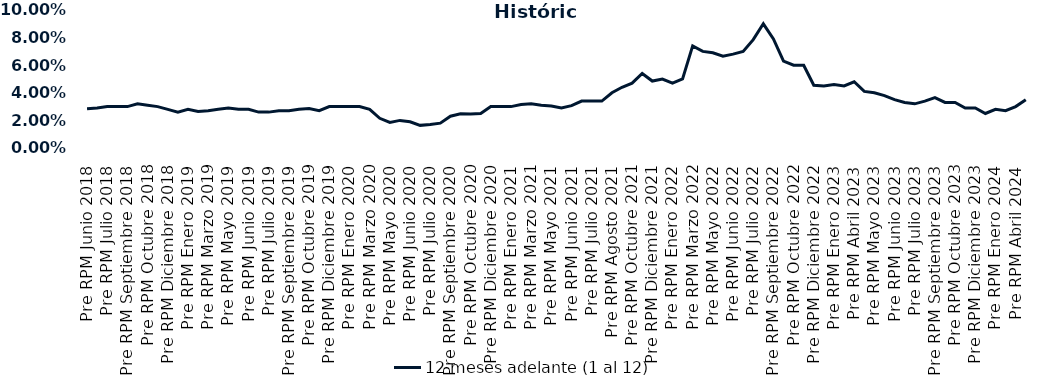
| Category | 12 meses adelante (1 al 12)  |
|---|---|
| Pre RPM Junio 2018 | 0.028 |
| Post RPM Junio 2018 | 0.029 |
| Pre RPM Julio 2018 | 0.03 |
| Post RPM Julio 2018 | 0.03 |
| Pre RPM Septiembre 2018 | 0.03 |
| Post RPM Septiembre 2018 | 0.032 |
| Pre RPM Octubre 2018 | 0.031 |
| Post RPM Octubre 2018 | 0.03 |
| Pre RPM Diciembre 2018 | 0.028 |
| Post RPM Diciembre 2018 | 0.026 |
| Pre RPM Enero 2019 | 0.028 |
| Post RPM Enero 2019 | 0.026 |
| Pre RPM Marzo 2019 | 0.027 |
| Post RPM Marzo 2019 | 0.028 |
| Pre RPM Mayo 2019 | 0.029 |
| Post RPM Mayo 2019 | 0.028 |
| Pre RPM Junio 2019 | 0.028 |
| Post RPM Junio 2019 | 0.026 |
| Pre RPM Julio 2019 | 0.026 |
| Post RPM Julio 2019 | 0.027 |
| Pre RPM Septiembre 2019 | 0.027 |
| Post RPM Septiembre 2019 | 0.028 |
| Pre RPM Octubre 2019 | 0.029 |
| Post RPM Octubre 2019 | 0.027 |
| Pre RPM Diciembre 2019 | 0.03 |
| Post RPM Diciembre 2019 | 0.03 |
| Pre RPM Enero 2020 | 0.03 |
| Post RPM Enero 2020 | 0.03 |
| Pre RPM Marzo 2020 | 0.028 |
| Post RPM Marzo 2020 | 0.022 |
| Pre RPM Mayo 2020 | 0.018 |
| Post RPM Mayo 2020 | 0.02 |
| Pre RPM Junio 2020 | 0.019 |
| Post RPM Junio 2020 | 0.016 |
| Pre RPM Julio 2020 | 0.017 |
| Post RPM Julio 2020 | 0.018 |
| Pre RPM Septiembre 2020 | 0.023 |
| Post RPM Septiembre 2020 | 0.025 |
| Pre RPM Octubre 2020 | 0.025 |
| Post RPM Octubre 2020 | 0.025 |
| Pre RPM Diciembre 2020 | 0.03 |
| Post RPM Diciembre 2020 | 0.03 |
| Pre RPM Enero 2021 | 0.03 |
| Post RPM Enero 2021 | 0.032 |
| Pre RPM Marzo 2021 | 0.032 |
| Post RPM Marzo 2021 | 0.031 |
| Pre RPM Mayo 2021 | 0.03 |
| Post RPM Mayo 2021 | 0.029 |
| Pre RPM Junio 2021 | 0.031 |
| Post RPM Junio 2021 | 0.034 |
| Pre RPM Julio 2021 | 0.034 |
| Post RPM Julio 2021 | 0.034 |
| Pre RPM Agosto 2021 | 0.04 |
| Post RPM Agosto 2021 | 0.044 |
| Pre RPM Octubre 2021 | 0.047 |
| Post RPM Octubre 2021 | 0.054 |
| Pre RPM Diciembre 2021 | 0.048 |
| Post RPM Diciembre 2021 | 0.05 |
| Pre RPM Enero 2022 | 0.047 |
| Post RPM Enero 2022 | 0.05 |
| Pre RPM Marzo 2022 | 0.074 |
| Post RPM Marzo 2022 | 0.07 |
| Pre RPM Mayo 2022 | 0.069 |
| Post RPM Mayo 2022 | 0.066 |
| Pre RPM Junio 2022 | 0.068 |
| Post RPM Junio 2022 | 0.07 |
| Pre RPM Julio 2022 | 0.078 |
| Post RPM Julio 2022 | 0.09 |
| Pre RPM Septiembre 2022 | 0.079 |
| Post RPM Septiembre 2022 | 0.063 |
| Pre RPM Octubre 2022 | 0.06 |
| Post RPM Octubre 2022 | 0.06 |
| Pre RPM Diciembre 2022 | 0.046 |
| Post RPM Diciembre 2022 | 0.045 |
| Pre RPM Enero 2023 | 0.046 |
| Post RPM Enero 2023 | 0.045 |
| Pre RPM Abril 2023 | 0.048 |
| Post RPM Abril 2023 | 0.041 |
| Pre RPM Mayo 2023 | 0.04 |
| Post RPM Mayo 2023 | 0.038 |
| Pre RPM Junio 2023 | 0.035 |
| Post RPM Junio 2023 | 0.033 |
| Pre RPM Julio 2023 | 0.032 |
| Post RPM Julio 2023 | 0.034 |
| Pre RPM Septiembre 2023 | 0.036 |
| Post RPM Septiembre 2023 | 0.033 |
| Pre RPM Octubre 2023 | 0.033 |
| Post RPM Octubre 2023 | 0.029 |
| Pre RPM Diciembre 2023 | 0.029 |
| Post RPM Diciembre 2023 | 0.025 |
| Pre RPM Enero 2024 | 0.028 |
| Post RPM Enero 2024 | 0.027 |
| Pre RPM Abril 2024 | 0.03 |
| Post RPM Abril 2024 | 0.035 |